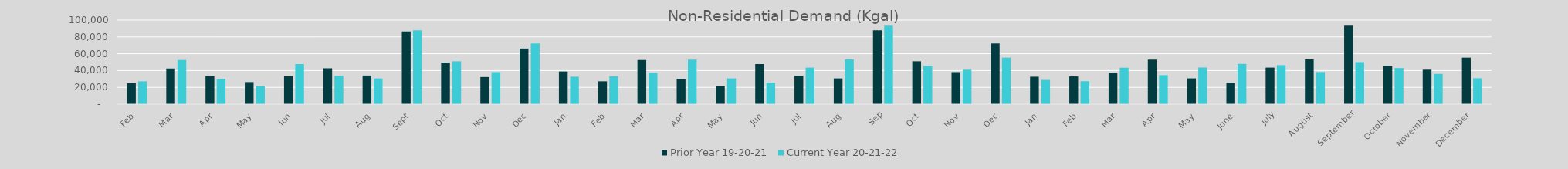
| Category | Prior Year 19-20-21 | Current Year 20-21-22 |
|---|---|---|
| Feb | 24891.705 | 27184.287 |
| Mar | 42416.796 | 52556.784 |
| Apr | 33427.881 | 30008.586 |
| May | 26254.448 | 21459.484 |
| Jun | 33248.873 | 47687.401 |
| Jul | 42679.938 | 33702.696 |
| Aug | 34036.498 | 30630.765 |
| Sep | 86367.775 | 87939.966 |
| Oct | 49561.754 | 51017.647 |
| Nov | 32261.42 | 38090.247 |
| Dec | 66164.871 | 72201.815 |
| Jan | 38851.995 | 32645.301 |
| Feb | 27184.287 | 32987.653 |
| Mar | 52556.784 | 37296.185 |
| Apr | 30008.586 | 52983.593 |
| May | 21459.484 | 30657.737 |
| Jun | 47687.401 | 25485.258 |
| Jul | 33702.696 | 43493.567 |
| Aug | 30630.765 | 53305.831 |
| Sep | 87939.966 | 93442.494 |
| Oct | 51017.647 | 45586.98 |
| Nov | 38090.247 | 41019.482 |
| Dec | 72201.815 | 55350.474 |
| Jan | 32645.301 | 28832.602 |
| Feb | 32987.653 | 27305.762 |
| Mar | 37296.185 | 43384.037 |
| Apr | 52983.593 | 34485.291 |
| May | 30657.737 | 43618.865 |
| June | 25485.258 | 47925.22 |
| July | 43493.567 | 46450.441 |
| August | 53305.831 | 38203.345 |
| September | 93442.494 | 50043.287 |
| October | 45586.98 | 42946.487 |
| November | 41019.482 | 36008.271 |
| December | 55350.474 | 30822.784 |